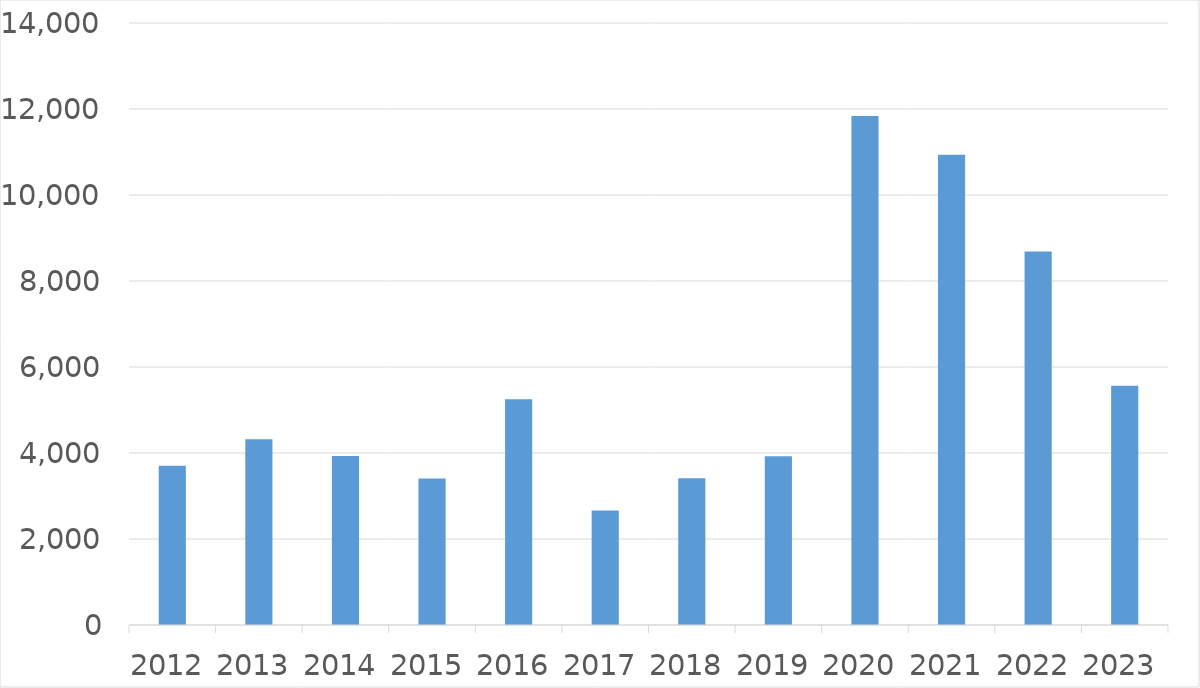
| Category | Series 0 |
|---|---|
| 2012 | 3706 |
| 2013 | 4321 |
| 2014 | 3928 |
| 2015 | 3405 |
| 2016 | 5249 |
| 2017 | 2664 |
| 2018 | 3410 |
| 2019 | 3923 |
| 2020 | 11835 |
| 2021 | 10937 |
| 2022 | 8685 |
| 2023 | 5562 |